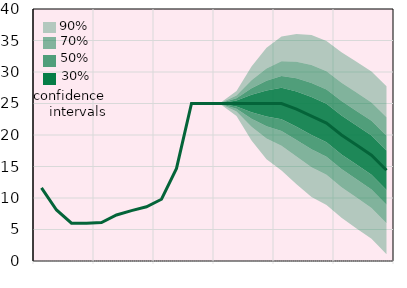
| Category | Облікова ставка, % |
|---|---|
|  | 11.6 |
|  | 8.1 |
|  | 6 |
| IV.20 | 6 |
|  | 6.1 |
|  | 7.3 |
|  | 8 |
| IV.21 | 8.6 |
|  | 9.8 |
|  | 14.7 |
|  | 25 |
| IV.22 | 25 |
|  | 25 |
|  | 25 |
|  | 25 |
| IV.23 | 25 |
|  | 25 |
|  | 24.1 |
|  | 23 |
| IV.24 | 21.9 |
|  | 20 |
|  | 18.4 |
|  | 16.8 |
| IV.25 | 14.4 |